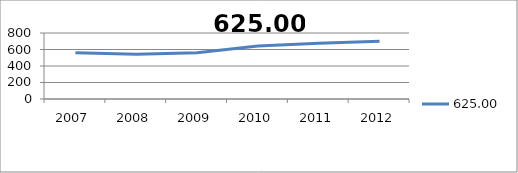
| Category | 625.00 |
|---|---|
| 2007.0 | 561 |
| 2008.0 | 542 |
| 2009.0 | 562 |
| 2010.0 | 641 |
| 2011.0 | 676 |
| 2012.0 | 700 |